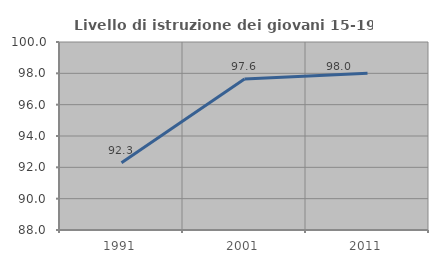
| Category | Livello di istruzione dei giovani 15-19 anni |
|---|---|
| 1991.0 | 92.291 |
| 2001.0 | 97.638 |
| 2011.0 | 98.007 |